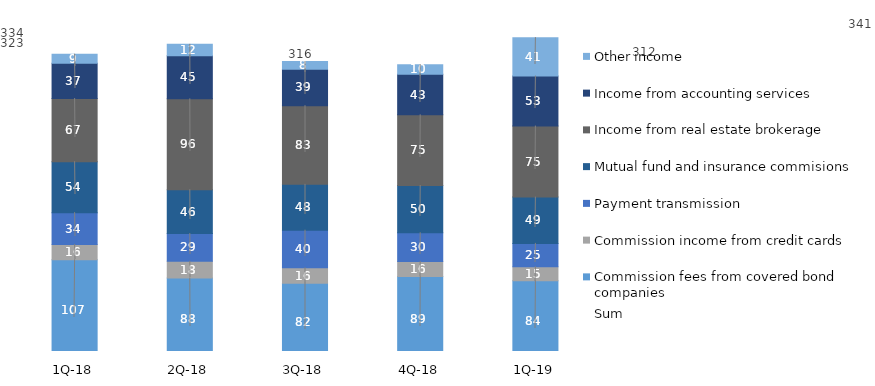
| Category | Commission fees from covered bond companies | Commission income from credit cards | Payment transmission | Mutual fund and insurance commisions | Income from real estate brokerage | Income from accounting services | Other income |
|---|---|---|---|---|---|---|---|
| 1Q-19 | 84.47 | 14.808 | 24.665 | 48.809 | 74.895 | 52.707 | 40.514 |
| 4Q-18 | 88.946 | 15.972 | 30.264 | 49.714 | 74.631 | 42.743 | 10.109 |
| 3Q-18 | 81.9 | 16.26 | 39.73 | 48.31 | 82.95 | 38.5 | 7.99 |
| 2Q-18 | 87.5 | 17.57 | 29.25 | 46.31 | 95.71 | 45.44 | 12 |
| 1Q-18 | 106.7 | 16.1 | 33.6 | 53.7 | 66.6 | 37.3 | 9.4 |